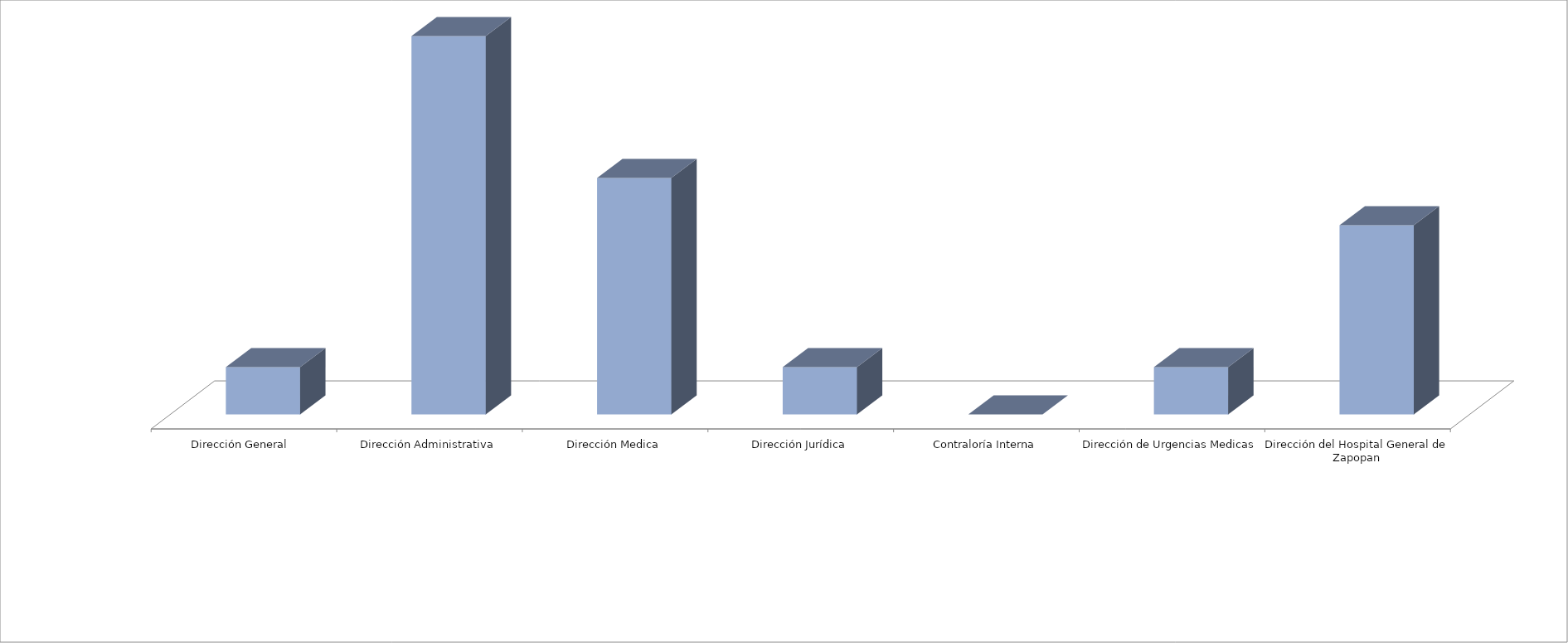
| Category | Series 0 | Series 1 |
|---|---|---|
| Dirección General  |  | 2 |
| Dirección Administrativa |  | 16 |
| Dirección Medica |  | 10 |
| Dirección Jurídica |  | 2 |
| Contraloría Interna |  | 0 |
| Dirección de Urgencias Medicas |  | 2 |
| Dirección del Hospital General de Zapopan |  | 8 |